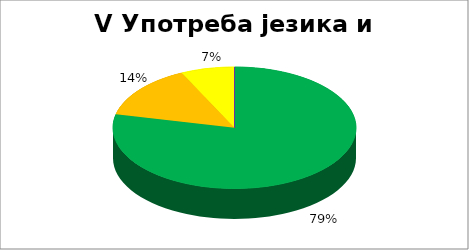
| Category | V Употреба језика и писма |
|---|---|
| 0 | 0.786 |
| 1 | 0.143 |
| 2 | 0.071 |
| 3 | 0 |
| 4 | 0 |